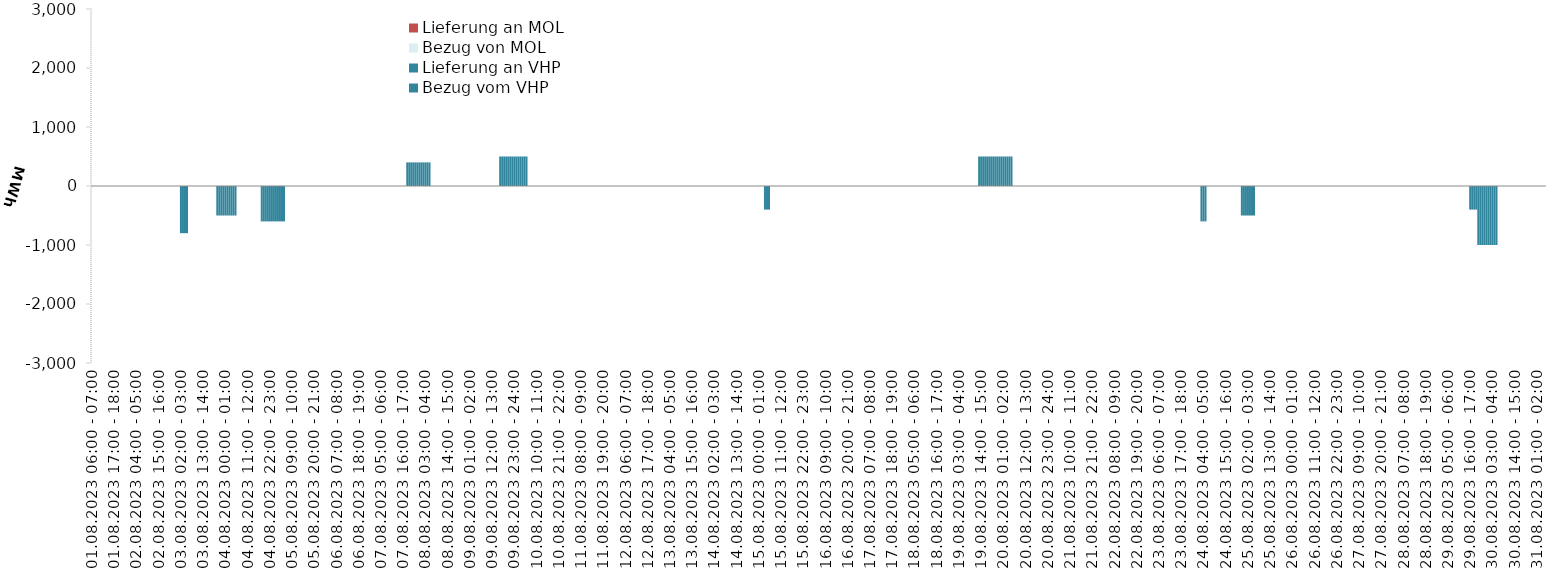
| Category | Bezug vom VHP | Lieferung an VHP | Bezug von MOL | Lieferung an MOL |
|---|---|---|---|---|
| 01.08.2023 06:00 - 07:00 | 0 | 0 | 0 | 0 |
| 01.08.2023 07:00 - 08:00 | 0 | 0 | 0 | 0 |
| 01.08.2023 08:00 - 09:00 | 0 | 0 | 0 | 0 |
| 01.08.2023 09:00 - 10:00 | 0 | 0 | 0 | 0 |
| 01.08.2023 10:00 - 11:00 | 0 | 0 | 0 | 0 |
| 01.08.2023 11:00 - 12:00 | 0 | 0 | 0 | 0 |
| 01.08.2023 12:00 - 13:00 | 0 | 0 | 0 | 0 |
| 01.08.2023 13:00 - 14:00 | 0 | 0 | 0 | 0 |
| 01.08.2023 14:00 - 15:00 | 0 | 0 | 0 | 0 |
| 01.08.2023 15:00 - 16:00 | 0 | 0 | 0 | 0 |
| 01.08.2023 16:00 - 17:00 | 0 | 0 | 0 | 0 |
| 01.08.2023 17:00 - 18:00 | 0 | 0 | 0 | 0 |
| 01.08.2023 18:00 - 19:00 | 0 | 0 | 0 | 0 |
| 01.08.2023 19:00 - 20:00 | 0 | 0 | 0 | 0 |
| 01.08.2023 20:00 - 21:00 | 0 | 0 | 0 | 0 |
| 01.08.2023 21:00 - 22:00 | 0 | 0 | 0 | 0 |
| 01.08.2023 22:00 - 23:00 | 0 | 0 | 0 | 0 |
| 01.08.2023 23:00 - 24:00 | 0 | 0 | 0 | 0 |
| 02.08.2023 00:00 - 01:00 | 0 | 0 | 0 | 0 |
| 02.08.2023 01:00 - 02:00 | 0 | 0 | 0 | 0 |
| 02.08.2023 02:00 - 03:00 | 0 | 0 | 0 | 0 |
| 02.08.2023 03:00 - 04:00 | 0 | 0 | 0 | 0 |
| 02.08.2023 04:00 - 05:00 | 0 | 0 | 0 | 0 |
| 02.08.2023 05:00 - 06:00 | 0 | 0 | 0 | 0 |
| 02.08.2023 06:00 - 07:00 | 0 | 0 | 0 | 0 |
| 02.08.2023 07:00 - 08:00 | 0 | 0 | 0 | 0 |
| 02.08.2023 08:00 - 09:00 | 0 | 0 | 0 | 0 |
| 02.08.2023 09:00 - 10:00 | 0 | 0 | 0 | 0 |
| 02.08.2023 10:00 - 11:00 | 0 | 0 | 0 | 0 |
| 02.08.2023 11:00 - 12:00 | 0 | 0 | 0 | 0 |
| 02.08.2023 12:00 - 13:00 | 0 | 0 | 0 | 0 |
| 02.08.2023 13:00 - 14:00 | 0 | 0 | 0 | 0 |
| 02.08.2023 14:00 - 15:00 | 0 | 0 | 0 | 0 |
| 02.08.2023 15:00 - 16:00 | 0 | 0 | 0 | 0 |
| 02.08.2023 16:00 - 17:00 | 0 | 0 | 0 | 0 |
| 02.08.2023 17:00 - 18:00 | 0 | 0 | 0 | 0 |
| 02.08.2023 18:00 - 19:00 | 0 | 0 | 0 | 0 |
| 02.08.2023 19:00 - 20:00 | 0 | 0 | 0 | 0 |
| 02.08.2023 20:00 - 21:00 | 0 | 0 | 0 | 0 |
| 02.08.2023 21:00 - 22:00 | 0 | 0 | 0 | 0 |
| 02.08.2023 22:00 - 23:00 | 0 | 0 | 0 | 0 |
| 02.08.2023 23:00 - 24:00 | 0 | 0 | 0 | 0 |
| 03.08.2023 00:00 - 01:00 | 0 | 0 | 0 | 0 |
| 03.08.2023 01:00 - 02:00 | 0 | 0 | 0 | 0 |
| 03.08.2023 02:00 - 03:00 | 0 | -800 | 0 | 0 |
| 03.08.2023 03:00 - 04:00 | 0 | -800 | 0 | 0 |
| 03.08.2023 04:00 - 05:00 | 0 | -800 | 0 | 0 |
| 03.08.2023 05:00 - 06:00 | 0 | -800 | 0 | 0 |
| 03.08.2023 06:00 - 07:00 | 0 | 0 | 0 | 0 |
| 03.08.2023 07:00 - 08:00 | 0 | 0 | 0 | 0 |
| 03.08.2023 08:00 - 09:00 | 0 | 0 | 0 | 0 |
| 03.08.2023 09:00 - 10:00 | 0 | 0 | 0 | 0 |
| 03.08.2023 10:00 - 11:00 | 0 | 0 | 0 | 0 |
| 03.08.2023 11:00 - 12:00 | 0 | 0 | 0 | 0 |
| 03.08.2023 12:00 - 13:00 | 0 | 0 | 0 | 0 |
| 03.08.2023 13:00 - 14:00 | 0 | 0 | 0 | 0 |
| 03.08.2023 14:00 - 15:00 | 0 | 0 | 0 | 0 |
| 03.08.2023 15:00 - 16:00 | 0 | 0 | 0 | 0 |
| 03.08.2023 16:00 - 17:00 | 0 | 0 | 0 | 0 |
| 03.08.2023 17:00 - 18:00 | 0 | 0 | 0 | 0 |
| 03.08.2023 18:00 - 19:00 | 0 | 0 | 0 | 0 |
| 03.08.2023 19:00 - 20:00 | 0 | 0 | 0 | 0 |
| 03.08.2023 20:00 - 21:00 | 0 | -500 | 0 | 0 |
| 03.08.2023 21:00 - 22:00 | 0 | -500 | 0 | 0 |
| 03.08.2023 22:00 - 23:00 | 0 | -500 | 0 | 0 |
| 03.08.2023 23:00 - 24:00 | 0 | -500 | 0 | 0 |
| 04.08.2023 00:00 - 01:00 | 0 | -500 | 0 | 0 |
| 04.08.2023 01:00 - 02:00 | 0 | -500 | 0 | 0 |
| 04.08.2023 02:00 - 03:00 | 0 | -500 | 0 | 0 |
| 04.08.2023 03:00 - 04:00 | 0 | -500 | 0 | 0 |
| 04.08.2023 04:00 - 05:00 | 0 | -500 | 0 | 0 |
| 04.08.2023 05:00 - 06:00 | 0 | -500 | 0 | 0 |
| 04.08.2023 06:00 - 07:00 | 0 | 0 | 0 | 0 |
| 04.08.2023 07:00 - 08:00 | 0 | 0 | 0 | 0 |
| 04.08.2023 08:00 - 09:00 | 0 | 0 | 0 | 0 |
| 04.08.2023 09:00 - 10:00 | 0 | 0 | 0 | 0 |
| 04.08.2023 10:00 - 11:00 | 0 | 0 | 0 | 0 |
| 04.08.2023 11:00 - 12:00 | 0 | 0 | 0 | 0 |
| 04.08.2023 12:00 - 13:00 | 0 | 0 | 0 | 0 |
| 04.08.2023 13:00 - 14:00 | 0 | 0 | 0 | 0 |
| 04.08.2023 14:00 - 15:00 | 0 | 0 | 0 | 0 |
| 04.08.2023 15:00 - 16:00 | 0 | 0 | 0 | 0 |
| 04.08.2023 16:00 - 17:00 | 0 | 0 | 0 | 0 |
| 04.08.2023 17:00 - 18:00 | 0 | 0 | 0 | 0 |
| 04.08.2023 18:00 - 19:00 | 0 | -600 | 0 | 0 |
| 04.08.2023 19:00 - 20:00 | 0 | -600 | 0 | 0 |
| 04.08.2023 20:00 - 21:00 | 0 | -600 | 0 | 0 |
| 04.08.2023 21:00 - 22:00 | 0 | -600 | 0 | 0 |
| 04.08.2023 22:00 - 23:00 | 0 | -600 | 0 | 0 |
| 04.08.2023 23:00 - 24:00 | 0 | -600 | 0 | 0 |
| 05.08.2023 00:00 - 01:00 | 0 | -600 | 0 | 0 |
| 05.08.2023 01:00 - 02:00 | 0 | -600 | 0 | 0 |
| 05.08.2023 02:00 - 03:00 | 0 | -600 | 0 | 0 |
| 05.08.2023 03:00 - 04:00 | 0 | -600 | 0 | 0 |
| 05.08.2023 04:00 - 05:00 | 0 | -600 | 0 | 0 |
| 05.08.2023 05:00 - 06:00 | 0 | -600 | 0 | 0 |
| 05.08.2023 06:00 - 07:00 | 0 | 0 | 0 | 0 |
| 05.08.2023 07:00 - 08:00 | 0 | 0 | 0 | 0 |
| 05.08.2023 08:00 - 09:00 | 0 | 0 | 0 | 0 |
| 05.08.2023 09:00 - 10:00 | 0 | 0 | 0 | 0 |
| 05.08.2023 10:00 - 11:00 | 0 | 0 | 0 | 0 |
| 05.08.2023 11:00 - 12:00 | 0 | 0 | 0 | 0 |
| 05.08.2023 12:00 - 13:00 | 0 | 0 | 0 | 0 |
| 05.08.2023 13:00 - 14:00 | 0 | 0 | 0 | 0 |
| 05.08.2023 14:00 - 15:00 | 0 | 0 | 0 | 0 |
| 05.08.2023 15:00 - 16:00 | 0 | 0 | 0 | 0 |
| 05.08.2023 16:00 - 17:00 | 0 | 0 | 0 | 0 |
| 05.08.2023 17:00 - 18:00 | 0 | 0 | 0 | 0 |
| 05.08.2023 18:00 - 19:00 | 0 | 0 | 0 | 0 |
| 05.08.2023 19:00 - 20:00 | 0 | 0 | 0 | 0 |
| 05.08.2023 20:00 - 21:00 | 0 | 0 | 0 | 0 |
| 05.08.2023 21:00 - 22:00 | 0 | 0 | 0 | 0 |
| 05.08.2023 22:00 - 23:00 | 0 | 0 | 0 | 0 |
| 05.08.2023 23:00 - 24:00 | 0 | 0 | 0 | 0 |
| 06.08.2023 00:00 - 01:00 | 0 | 0 | 0 | 0 |
| 06.08.2023 01:00 - 02:00 | 0 | 0 | 0 | 0 |
| 06.08.2023 02:00 - 03:00 | 0 | 0 | 0 | 0 |
| 06.08.2023 03:00 - 04:00 | 0 | 0 | 0 | 0 |
| 06.08.2023 04:00 - 05:00 | 0 | 0 | 0 | 0 |
| 06.08.2023 05:00 - 06:00 | 0 | 0 | 0 | 0 |
| 06.08.2023 06:00 - 07:00 | 0 | 0 | 0 | 0 |
| 06.08.2023 07:00 - 08:00 | 0 | 0 | 0 | 0 |
| 06.08.2023 08:00 - 09:00 | 0 | 0 | 0 | 0 |
| 06.08.2023 09:00 - 10:00 | 0 | 0 | 0 | 0 |
| 06.08.2023 10:00 - 11:00 | 0 | 0 | 0 | 0 |
| 06.08.2023 11:00 - 12:00 | 0 | 0 | 0 | 0 |
| 06.08.2023 12:00 - 13:00 | 0 | 0 | 0 | 0 |
| 06.08.2023 13:00 - 14:00 | 0 | 0 | 0 | 0 |
| 06.08.2023 14:00 - 15:00 | 0 | 0 | 0 | 0 |
| 06.08.2023 15:00 - 16:00 | 0 | 0 | 0 | 0 |
| 06.08.2023 16:00 - 17:00 | 0 | 0 | 0 | 0 |
| 06.08.2023 17:00 - 18:00 | 0 | 0 | 0 | 0 |
| 06.08.2023 18:00 - 19:00 | 0 | 0 | 0 | 0 |
| 06.08.2023 19:00 - 20:00 | 0 | 0 | 0 | 0 |
| 06.08.2023 20:00 - 21:00 | 0 | 0 | 0 | 0 |
| 06.08.2023 21:00 - 22:00 | 0 | 0 | 0 | 0 |
| 06.08.2023 22:00 - 23:00 | 0 | 0 | 0 | 0 |
| 06.08.2023 23:00 - 24:00 | 0 | 0 | 0 | 0 |
| 07.08.2023 00:00 - 01:00 | 0 | 0 | 0 | 0 |
| 07.08.2023 01:00 - 02:00 | 0 | 0 | 0 | 0 |
| 07.08.2023 02:00 - 03:00 | 0 | 0 | 0 | 0 |
| 07.08.2023 03:00 - 04:00 | 0 | 0 | 0 | 0 |
| 07.08.2023 04:00 - 05:00 | 0 | 0 | 0 | 0 |
| 07.08.2023 05:00 - 06:00 | 0 | 0 | 0 | 0 |
| 07.08.2023 06:00 - 07:00 | 0 | 0 | 0 | 0 |
| 07.08.2023 07:00 - 08:00 | 0 | 0 | 0 | 0 |
| 07.08.2023 08:00 - 09:00 | 0 | 0 | 0 | 0 |
| 07.08.2023 09:00 - 10:00 | 0 | 0 | 0 | 0 |
| 07.08.2023 10:00 - 11:00 | 0 | 0 | 0 | 0 |
| 07.08.2023 11:00 - 12:00 | 0 | 0 | 0 | 0 |
| 07.08.2023 12:00 - 13:00 | 0 | 0 | 0 | 0 |
| 07.08.2023 13:00 - 14:00 | 0 | 0 | 0 | 0 |
| 07.08.2023 14:00 - 15:00 | 0 | 0 | 0 | 0 |
| 07.08.2023 15:00 - 16:00 | 0 | 0 | 0 | 0 |
| 07.08.2023 16:00 - 17:00 | 0 | 0 | 0 | 0 |
| 07.08.2023 17:00 - 18:00 | 0 | 0 | 0 | 0 |
| 07.08.2023 18:00 - 19:00 | 400 | 0 | 0 | 0 |
| 07.08.2023 19:00 - 20:00 | 400 | 0 | 0 | 0 |
| 07.08.2023 20:00 - 21:00 | 400 | 0 | 0 | 0 |
| 07.08.2023 21:00 - 22:00 | 400 | 0 | 0 | 0 |
| 07.08.2023 22:00 - 23:00 | 400 | 0 | 0 | 0 |
| 07.08.2023 23:00 - 24:00 | 400 | 0 | 0 | 0 |
| 08.08.2023 00:00 - 01:00 | 400 | 0 | 0 | 0 |
| 08.08.2023 01:00 - 02:00 | 400 | 0 | 0 | 0 |
| 08.08.2023 02:00 - 03:00 | 400 | 0 | 0 | 0 |
| 08.08.2023 03:00 - 04:00 | 400 | 0 | 0 | 0 |
| 08.08.2023 04:00 - 05:00 | 400 | 0 | 0 | 0 |
| 08.08.2023 05:00 - 06:00 | 400 | 0 | 0 | 0 |
| 08.08.2023 06:00 - 07:00 | 0 | 0 | 0 | 0 |
| 08.08.2023 07:00 - 08:00 | 0 | 0 | 0 | 0 |
| 08.08.2023 08:00 - 09:00 | 0 | 0 | 0 | 0 |
| 08.08.2023 09:00 - 10:00 | 0 | 0 | 0 | 0 |
| 08.08.2023 10:00 - 11:00 | 0 | 0 | 0 | 0 |
| 08.08.2023 11:00 - 12:00 | 0 | 0 | 0 | 0 |
| 08.08.2023 12:00 - 13:00 | 0 | 0 | 0 | 0 |
| 08.08.2023 13:00 - 14:00 | 0 | 0 | 0 | 0 |
| 08.08.2023 14:00 - 15:00 | 0 | 0 | 0 | 0 |
| 08.08.2023 15:00 - 16:00 | 0 | 0 | 0 | 0 |
| 08.08.2023 16:00 - 17:00 | 0 | 0 | 0 | 0 |
| 08.08.2023 17:00 - 18:00 | 0 | 0 | 0 | 0 |
| 08.08.2023 18:00 - 19:00 | 0 | 0 | 0 | 0 |
| 08.08.2023 19:00 - 20:00 | 0 | 0 | 0 | 0 |
| 08.08.2023 20:00 - 21:00 | 0 | 0 | 0 | 0 |
| 08.08.2023 21:00 - 22:00 | 0 | 0 | 0 | 0 |
| 08.08.2023 22:00 - 23:00 | 0 | 0 | 0 | 0 |
| 08.08.2023 23:00 - 24:00 | 0 | 0 | 0 | 0 |
| 09.08.2023 00:00 - 01:00 | 0 | 0 | 0 | 0 |
| 09.08.2023 01:00 - 02:00 | 0 | 0 | 0 | 0 |
| 09.08.2023 02:00 - 03:00 | 0 | 0 | 0 | 0 |
| 09.08.2023 03:00 - 04:00 | 0 | 0 | 0 | 0 |
| 09.08.2023 04:00 - 05:00 | 0 | 0 | 0 | 0 |
| 09.08.2023 05:00 - 06:00 | 0 | 0 | 0 | 0 |
| 09.08.2023 06:00 - 07:00 | 0 | 0 | 0 | 0 |
| 09.08.2023 07:00 - 08:00 | 0 | 0 | 0 | 0 |
| 09.08.2023 08:00 - 09:00 | 0 | 0 | 0 | 0 |
| 09.08.2023 09:00 - 10:00 | 0 | 0 | 0 | 0 |
| 09.08.2023 10:00 - 11:00 | 0 | 0 | 0 | 0 |
| 09.08.2023 11:00 - 12:00 | 0 | 0 | 0 | 0 |
| 09.08.2023 12:00 - 13:00 | 0 | 0 | 0 | 0 |
| 09.08.2023 13:00 - 14:00 | 0 | 0 | 0 | 0 |
| 09.08.2023 14:00 - 15:00 | 0 | 0 | 0 | 0 |
| 09.08.2023 15:00 - 16:00 | 0 | 0 | 0 | 0 |
| 09.08.2023 16:00 - 17:00 | 500 | 0 | 0 | 0 |
| 09.08.2023 17:00 - 18:00 | 500 | 0 | 0 | 0 |
| 09.08.2023 18:00 - 19:00 | 500 | 0 | 0 | 0 |
| 09.08.2023 19:00 - 20:00 | 500 | 0 | 0 | 0 |
| 09.08.2023 20:00 - 21:00 | 500 | 0 | 0 | 0 |
| 09.08.2023 21:00 - 22:00 | 500 | 0 | 0 | 0 |
| 09.08.2023 22:00 - 23:00 | 500 | 0 | 0 | 0 |
| 09.08.2023 23:00 - 24:00 | 500 | 0 | 0 | 0 |
| 10.08.2023 00:00 - 01:00 | 500 | 0 | 0 | 0 |
| 10.08.2023 01:00 - 02:00 | 500 | 0 | 0 | 0 |
| 10.08.2023 02:00 - 03:00 | 500 | 0 | 0 | 0 |
| 10.08.2023 03:00 - 04:00 | 500 | 0 | 0 | 0 |
| 10.08.2023 04:00 - 05:00 | 500 | 0 | 0 | 0 |
| 10.08.2023 05:00 - 06:00 | 500 | 0 | 0 | 0 |
| 10.08.2023 06:00 - 07:00 | 0 | 0 | 0 | 0 |
| 10.08.2023 07:00 - 08:00 | 0 | 0 | 0 | 0 |
| 10.08.2023 08:00 - 09:00 | 0 | 0 | 0 | 0 |
| 10.08.2023 09:00 - 10:00 | 0 | 0 | 0 | 0 |
| 10.08.2023 10:00 - 11:00 | 0 | 0 | 0 | 0 |
| 10.08.2023 11:00 - 12:00 | 0 | 0 | 0 | 0 |
| 10.08.2023 12:00 - 13:00 | 0 | 0 | 0 | 0 |
| 10.08.2023 13:00 - 14:00 | 0 | 0 | 0 | 0 |
| 10.08.2023 14:00 - 15:00 | 0 | 0 | 0 | 0 |
| 10.08.2023 15:00 - 16:00 | 0 | 0 | 0 | 0 |
| 10.08.2023 16:00 - 17:00 | 0 | 0 | 0 | 0 |
| 10.08.2023 17:00 - 18:00 | 0 | 0 | 0 | 0 |
| 10.08.2023 18:00 - 19:00 | 0 | 0 | 0 | 0 |
| 10.08.2023 19:00 - 20:00 | 0 | 0 | 0 | 0 |
| 10.08.2023 20:00 - 21:00 | 0 | 0 | 0 | 0 |
| 10.08.2023 21:00 - 22:00 | 0 | 0 | 0 | 0 |
| 10.08.2023 22:00 - 23:00 | 0 | 0 | 0 | 0 |
| 10.08.2023 23:00 - 24:00 | 0 | 0 | 0 | 0 |
| 11.08.2023 00:00 - 01:00 | 0 | 0 | 0 | 0 |
| 11.08.2023 01:00 - 02:00 | 0 | 0 | 0 | 0 |
| 11.08.2023 02:00 - 03:00 | 0 | 0 | 0 | 0 |
| 11.08.2023 03:00 - 04:00 | 0 | 0 | 0 | 0 |
| 11.08.2023 04:00 - 05:00 | 0 | 0 | 0 | 0 |
| 11.08.2023 05:00 - 06:00 | 0 | 0 | 0 | 0 |
| 11.08.2023 06:00 - 07:00 | 0 | 0 | 0 | 0 |
| 11.08.2023 07:00 - 08:00 | 0 | 0 | 0 | 0 |
| 11.08.2023 08:00 - 09:00 | 0 | 0 | 0 | 0 |
| 11.08.2023 09:00 - 10:00 | 0 | 0 | 0 | 0 |
| 11.08.2023 10:00 - 11:00 | 0 | 0 | 0 | 0 |
| 11.08.2023 11:00 - 12:00 | 0 | 0 | 0 | 0 |
| 11.08.2023 12:00 - 13:00 | 0 | 0 | 0 | 0 |
| 11.08.2023 13:00 - 14:00 | 0 | 0 | 0 | 0 |
| 11.08.2023 14:00 - 15:00 | 0 | 0 | 0 | 0 |
| 11.08.2023 15:00 - 16:00 | 0 | 0 | 0 | 0 |
| 11.08.2023 16:00 - 17:00 | 0 | 0 | 0 | 0 |
| 11.08.2023 17:00 - 18:00 | 0 | 0 | 0 | 0 |
| 11.08.2023 18:00 - 19:00 | 0 | 0 | 0 | 0 |
| 11.08.2023 19:00 - 20:00 | 0 | 0 | 0 | 0 |
| 11.08.2023 20:00 - 21:00 | 0 | 0 | 0 | 0 |
| 11.08.2023 21:00 - 22:00 | 0 | 0 | 0 | 0 |
| 11.08.2023 22:00 - 23:00 | 0 | 0 | 0 | 0 |
| 11.08.2023 23:00 - 24:00 | 0 | 0 | 0 | 0 |
| 12.08.2023 00:00 - 01:00 | 0 | 0 | 0 | 0 |
| 12.08.2023 01:00 - 02:00 | 0 | 0 | 0 | 0 |
| 12.08.2023 02:00 - 03:00 | 0 | 0 | 0 | 0 |
| 12.08.2023 03:00 - 04:00 | 0 | 0 | 0 | 0 |
| 12.08.2023 04:00 - 05:00 | 0 | 0 | 0 | 0 |
| 12.08.2023 05:00 - 06:00 | 0 | 0 | 0 | 0 |
| 12.08.2023 06:00 - 07:00 | 0 | 0 | 0 | 0 |
| 12.08.2023 07:00 - 08:00 | 0 | 0 | 0 | 0 |
| 12.08.2023 08:00 - 09:00 | 0 | 0 | 0 | 0 |
| 12.08.2023 09:00 - 10:00 | 0 | 0 | 0 | 0 |
| 12.08.2023 10:00 - 11:00 | 0 | 0 | 0 | 0 |
| 12.08.2023 11:00 - 12:00 | 0 | 0 | 0 | 0 |
| 12.08.2023 12:00 - 13:00 | 0 | 0 | 0 | 0 |
| 12.08.2023 13:00 - 14:00 | 0 | 0 | 0 | 0 |
| 12.08.2023 14:00 - 15:00 | 0 | 0 | 0 | 0 |
| 12.08.2023 15:00 - 16:00 | 0 | 0 | 0 | 0 |
| 12.08.2023 16:00 - 17:00 | 0 | 0 | 0 | 0 |
| 12.08.2023 17:00 - 18:00 | 0 | 0 | 0 | 0 |
| 12.08.2023 18:00 - 19:00 | 0 | 0 | 0 | 0 |
| 12.08.2023 19:00 - 20:00 | 0 | 0 | 0 | 0 |
| 12.08.2023 20:00 - 21:00 | 0 | 0 | 0 | 0 |
| 12.08.2023 21:00 - 22:00 | 0 | 0 | 0 | 0 |
| 12.08.2023 22:00 - 23:00 | 0 | 0 | 0 | 0 |
| 12.08.2023 23:00 - 24:00 | 0 | 0 | 0 | 0 |
| 13.08.2023 00:00 - 01:00 | 0 | 0 | 0 | 0 |
| 13.08.2023 01:00 - 02:00 | 0 | 0 | 0 | 0 |
| 13.08.2023 02:00 - 03:00 | 0 | 0 | 0 | 0 |
| 13.08.2023 03:00 - 04:00 | 0 | 0 | 0 | 0 |
| 13.08.2023 04:00 - 05:00 | 0 | 0 | 0 | 0 |
| 13.08.2023 05:00 - 06:00 | 0 | 0 | 0 | 0 |
| 13.08.2023 06:00 - 07:00 | 0 | 0 | 0 | 0 |
| 13.08.2023 07:00 - 08:00 | 0 | 0 | 0 | 0 |
| 13.08.2023 08:00 - 09:00 | 0 | 0 | 0 | 0 |
| 13.08.2023 09:00 - 10:00 | 0 | 0 | 0 | 0 |
| 13.08.2023 10:00 - 11:00 | 0 | 0 | 0 | 0 |
| 13.08.2023 11:00 - 12:00 | 0 | 0 | 0 | 0 |
| 13.08.2023 12:00 - 13:00 | 0 | 0 | 0 | 0 |
| 13.08.2023 13:00 - 14:00 | 0 | 0 | 0 | 0 |
| 13.08.2023 14:00 - 15:00 | 0 | 0 | 0 | 0 |
| 13.08.2023 15:00 - 16:00 | 0 | 0 | 0 | 0 |
| 13.08.2023 16:00 - 17:00 | 0 | 0 | 0 | 0 |
| 13.08.2023 17:00 - 18:00 | 0 | 0 | 0 | 0 |
| 13.08.2023 18:00 - 19:00 | 0 | 0 | 0 | 0 |
| 13.08.2023 19:00 - 20:00 | 0 | 0 | 0 | 0 |
| 13.08.2023 20:00 - 21:00 | 0 | 0 | 0 | 0 |
| 13.08.2023 21:00 - 22:00 | 0 | 0 | 0 | 0 |
| 13.08.2023 22:00 - 23:00 | 0 | 0 | 0 | 0 |
| 13.08.2023 23:00 - 24:00 | 0 | 0 | 0 | 0 |
| 14.08.2023 00:00 - 01:00 | 0 | 0 | 0 | 0 |
| 14.08.2023 01:00 - 02:00 | 0 | 0 | 0 | 0 |
| 14.08.2023 02:00 - 03:00 | 0 | 0 | 0 | 0 |
| 14.08.2023 03:00 - 04:00 | 0 | 0 | 0 | 0 |
| 14.08.2023 04:00 - 05:00 | 0 | 0 | 0 | 0 |
| 14.08.2023 05:00 - 06:00 | 0 | 0 | 0 | 0 |
| 14.08.2023 06:00 - 07:00 | 0 | 0 | 0 | 0 |
| 14.08.2023 07:00 - 08:00 | 0 | 0 | 0 | 0 |
| 14.08.2023 08:00 - 09:00 | 0 | 0 | 0 | 0 |
| 14.08.2023 09:00 - 10:00 | 0 | 0 | 0 | 0 |
| 14.08.2023 10:00 - 11:00 | 0 | 0 | 0 | 0 |
| 14.08.2023 11:00 - 12:00 | 0 | 0 | 0 | 0 |
| 14.08.2023 12:00 - 13:00 | 0 | 0 | 0 | 0 |
| 14.08.2023 13:00 - 14:00 | 0 | 0 | 0 | 0 |
| 14.08.2023 14:00 - 15:00 | 0 | 0 | 0 | 0 |
| 14.08.2023 15:00 - 16:00 | 0 | 0 | 0 | 0 |
| 14.08.2023 16:00 - 17:00 | 0 | 0 | 0 | 0 |
| 14.08.2023 17:00 - 18:00 | 0 | 0 | 0 | 0 |
| 14.08.2023 18:00 - 19:00 | 0 | 0 | 0 | 0 |
| 14.08.2023 19:00 - 20:00 | 0 | 0 | 0 | 0 |
| 14.08.2023 20:00 - 21:00 | 0 | 0 | 0 | 0 |
| 14.08.2023 21:00 - 22:00 | 0 | 0 | 0 | 0 |
| 14.08.2023 22:00 - 23:00 | 0 | 0 | 0 | 0 |
| 14.08.2023 23:00 - 24:00 | 0 | 0 | 0 | 0 |
| 15.08.2023 00:00 - 01:00 | 0 | 0 | 0 | 0 |
| 15.08.2023 01:00 - 02:00 | 0 | 0 | 0 | 0 |
| 15.08.2023 02:00 - 03:00 | 0 | 0 | 0 | 0 |
| 15.08.2023 03:00 - 04:00 | 0 | -400 | 0 | 0 |
| 15.08.2023 04:00 - 05:00 | 0 | -400 | 0 | 0 |
| 15.08.2023 05:00 - 06:00 | 0 | -400 | 0 | 0 |
| 15.08.2023 06:00 - 07:00 | 0 | 0 | 0 | 0 |
| 15.08.2023 07:00 - 08:00 | 0 | 0 | 0 | 0 |
| 15.08.2023 08:00 - 09:00 | 0 | 0 | 0 | 0 |
| 15.08.2023 09:00 - 10:00 | 0 | 0 | 0 | 0 |
| 15.08.2023 10:00 - 11:00 | 0 | 0 | 0 | 0 |
| 15.08.2023 11:00 - 12:00 | 0 | 0 | 0 | 0 |
| 15.08.2023 12:00 - 13:00 | 0 | 0 | 0 | 0 |
| 15.08.2023 13:00 - 14:00 | 0 | 0 | 0 | 0 |
| 15.08.2023 14:00 - 15:00 | 0 | 0 | 0 | 0 |
| 15.08.2023 15:00 - 16:00 | 0 | 0 | 0 | 0 |
| 15.08.2023 16:00 - 17:00 | 0 | 0 | 0 | 0 |
| 15.08.2023 17:00 - 18:00 | 0 | 0 | 0 | 0 |
| 15.08.2023 18:00 - 19:00 | 0 | 0 | 0 | 0 |
| 15.08.2023 19:00 - 20:00 | 0 | 0 | 0 | 0 |
| 15.08.2023 20:00 - 21:00 | 0 | 0 | 0 | 0 |
| 15.08.2023 21:00 - 22:00 | 0 | 0 | 0 | 0 |
| 15.08.2023 22:00 - 23:00 | 0 | 0 | 0 | 0 |
| 15.08.2023 23:00 - 24:00 | 0 | 0 | 0 | 0 |
| 16.08.2023 00:00 - 01:00 | 0 | 0 | 0 | 0 |
| 16.08.2023 01:00 - 02:00 | 0 | 0 | 0 | 0 |
| 16.08.2023 02:00 - 03:00 | 0 | 0 | 0 | 0 |
| 16.08.2023 03:00 - 04:00 | 0 | 0 | 0 | 0 |
| 16.08.2023 04:00 - 05:00 | 0 | 0 | 0 | 0 |
| 16.08.2023 05:00 - 06:00 | 0 | 0 | 0 | 0 |
| 16.08.2023 06:00 - 07:00 | 0 | 0 | 0 | 0 |
| 16.08.2023 07:00 - 08:00 | 0 | 0 | 0 | 0 |
| 16.08.2023 08:00 - 09:00 | 0 | 0 | 0 | 0 |
| 16.08.2023 09:00 - 10:00 | 0 | 0 | 0 | 0 |
| 16.08.2023 10:00 - 11:00 | 0 | 0 | 0 | 0 |
| 16.08.2023 11:00 - 12:00 | 0 | 0 | 0 | 0 |
| 16.08.2023 12:00 - 13:00 | 0 | 0 | 0 | 0 |
| 16.08.2023 13:00 - 14:00 | 0 | 0 | 0 | 0 |
| 16.08.2023 14:00 - 15:00 | 0 | 0 | 0 | 0 |
| 16.08.2023 15:00 - 16:00 | 0 | 0 | 0 | 0 |
| 16.08.2023 16:00 - 17:00 | 0 | 0 | 0 | 0 |
| 16.08.2023 17:00 - 18:00 | 0 | 0 | 0 | 0 |
| 16.08.2023 18:00 - 19:00 | 0 | 0 | 0 | 0 |
| 16.08.2023 19:00 - 20:00 | 0 | 0 | 0 | 0 |
| 16.08.2023 20:00 - 21:00 | 0 | 0 | 0 | 0 |
| 16.08.2023 21:00 - 22:00 | 0 | 0 | 0 | 0 |
| 16.08.2023 22:00 - 23:00 | 0 | 0 | 0 | 0 |
| 16.08.2023 23:00 - 24:00 | 0 | 0 | 0 | 0 |
| 17.08.2023 00:00 - 01:00 | 0 | 0 | 0 | 0 |
| 17.08.2023 01:00 - 02:00 | 0 | 0 | 0 | 0 |
| 17.08.2023 02:00 - 03:00 | 0 | 0 | 0 | 0 |
| 17.08.2023 03:00 - 04:00 | 0 | 0 | 0 | 0 |
| 17.08.2023 04:00 - 05:00 | 0 | 0 | 0 | 0 |
| 17.08.2023 05:00 - 06:00 | 0 | 0 | 0 | 0 |
| 17.08.2023 06:00 - 07:00 | 0 | 0 | 0 | 0 |
| 17.08.2023 07:00 - 08:00 | 0 | 0 | 0 | 0 |
| 17.08.2023 08:00 - 09:00 | 0 | 0 | 0 | 0 |
| 17.08.2023 09:00 - 10:00 | 0 | 0 | 0 | 0 |
| 17.08.2023 10:00 - 11:00 | 0 | 0 | 0 | 0 |
| 17.08.2023 11:00 - 12:00 | 0 | 0 | 0 | 0 |
| 17.08.2023 12:00 - 13:00 | 0 | 0 | 0 | 0 |
| 17.08.2023 13:00 - 14:00 | 0 | 0 | 0 | 0 |
| 17.08.2023 14:00 - 15:00 | 0 | 0 | 0 | 0 |
| 17.08.2023 15:00 - 16:00 | 0 | 0 | 0 | 0 |
| 17.08.2023 16:00 - 17:00 | 0 | 0 | 0 | 0 |
| 17.08.2023 17:00 - 18:00 | 0 | 0 | 0 | 0 |
| 17.08.2023 18:00 - 19:00 | 0 | 0 | 0 | 0 |
| 17.08.2023 19:00 - 20:00 | 0 | 0 | 0 | 0 |
| 17.08.2023 20:00 - 21:00 | 0 | 0 | 0 | 0 |
| 17.08.2023 21:00 - 22:00 | 0 | 0 | 0 | 0 |
| 17.08.2023 22:00 - 23:00 | 0 | 0 | 0 | 0 |
| 17.08.2023 23:00 - 24:00 | 0 | 0 | 0 | 0 |
| 18.08.2023 00:00 - 01:00 | 0 | 0 | 0 | 0 |
| 18.08.2023 01:00 - 02:00 | 0 | 0 | 0 | 0 |
| 18.08.2023 02:00 - 03:00 | 0 | 0 | 0 | 0 |
| 18.08.2023 03:00 - 04:00 | 0 | 0 | 0 | 0 |
| 18.08.2023 04:00 - 05:00 | 0 | 0 | 0 | 0 |
| 18.08.2023 05:00 - 06:00 | 0 | 0 | 0 | 0 |
| 18.08.2023 06:00 - 07:00 | 0 | 0 | 0 | 0 |
| 18.08.2023 07:00 - 08:00 | 0 | 0 | 0 | 0 |
| 18.08.2023 08:00 - 09:00 | 0 | 0 | 0 | 0 |
| 18.08.2023 09:00 - 10:00 | 0 | 0 | 0 | 0 |
| 18.08.2023 10:00 - 11:00 | 0 | 0 | 0 | 0 |
| 18.08.2023 11:00 - 12:00 | 0 | 0 | 0 | 0 |
| 18.08.2023 12:00 - 13:00 | 0 | 0 | 0 | 0 |
| 18.08.2023 13:00 - 14:00 | 0 | 0 | 0 | 0 |
| 18.08.2023 14:00 - 15:00 | 0 | 0 | 0 | 0 |
| 18.08.2023 15:00 - 16:00 | 0 | 0 | 0 | 0 |
| 18.08.2023 16:00 - 17:00 | 0 | 0 | 0 | 0 |
| 18.08.2023 17:00 - 18:00 | 0 | 0 | 0 | 0 |
| 18.08.2023 18:00 - 19:00 | 0 | 0 | 0 | 0 |
| 18.08.2023 19:00 - 20:00 | 0 | 0 | 0 | 0 |
| 18.08.2023 20:00 - 21:00 | 0 | 0 | 0 | 0 |
| 18.08.2023 21:00 - 22:00 | 0 | 0 | 0 | 0 |
| 18.08.2023 22:00 - 23:00 | 0 | 0 | 0 | 0 |
| 18.08.2023 23:00 - 24:00 | 0 | 0 | 0 | 0 |
| 19.08.2023 00:00 - 01:00 | 0 | 0 | 0 | 0 |
| 19.08.2023 01:00 - 02:00 | 0 | 0 | 0 | 0 |
| 19.08.2023 02:00 - 03:00 | 0 | 0 | 0 | 0 |
| 19.08.2023 03:00 - 04:00 | 0 | 0 | 0 | 0 |
| 19.08.2023 04:00 - 05:00 | 0 | 0 | 0 | 0 |
| 19.08.2023 05:00 - 06:00 | 0 | 0 | 0 | 0 |
| 19.08.2023 06:00 - 07:00 | 0 | 0 | 0 | 0 |
| 19.08.2023 07:00 - 08:00 | 0 | 0 | 0 | 0 |
| 19.08.2023 08:00 - 09:00 | 0 | 0 | 0 | 0 |
| 19.08.2023 09:00 - 10:00 | 0 | 0 | 0 | 0 |
| 19.08.2023 10:00 - 11:00 | 0 | 0 | 0 | 0 |
| 19.08.2023 11:00 - 12:00 | 0 | 0 | 0 | 0 |
| 19.08.2023 12:00 - 13:00 | 0 | 0 | 0 | 0 |
| 19.08.2023 13:00 - 14:00 | 500 | 0 | 0 | 0 |
| 19.08.2023 14:00 - 15:00 | 500 | 0 | 0 | 0 |
| 19.08.2023 15:00 - 16:00 | 500 | 0 | 0 | 0 |
| 19.08.2023 16:00 - 17:00 | 500 | 0 | 0 | 0 |
| 19.08.2023 17:00 - 18:00 | 500 | 0 | 0 | 0 |
| 19.08.2023 18:00 - 19:00 | 500 | 0 | 0 | 0 |
| 19.08.2023 19:00 - 20:00 | 500 | 0 | 0 | 0 |
| 19.08.2023 20:00 - 21:00 | 500 | 0 | 0 | 0 |
| 19.08.2023 21:00 - 22:00 | 500 | 0 | 0 | 0 |
| 19.08.2023 22:00 - 23:00 | 500 | 0 | 0 | 0 |
| 19.08.2023 23:00 - 24:00 | 500 | 0 | 0 | 0 |
| 20.08.2023 00:00 - 01:00 | 500 | 0 | 0 | 0 |
| 20.08.2023 01:00 - 02:00 | 500 | 0 | 0 | 0 |
| 20.08.2023 02:00 - 03:00 | 500 | 0 | 0 | 0 |
| 20.08.2023 03:00 - 04:00 | 500 | 0 | 0 | 0 |
| 20.08.2023 04:00 - 05:00 | 500 | 0 | 0 | 0 |
| 20.08.2023 05:00 - 06:00 | 500 | 0 | 0 | 0 |
| 20.08.2023 06:00 - 07:00 | 0 | 0 | 0 | 0 |
| 20.08.2023 07:00 - 08:00 | 0 | 0 | 0 | 0 |
| 20.08.2023 08:00 - 09:00 | 0 | 0 | 0 | 0 |
| 20.08.2023 09:00 - 10:00 | 0 | 0 | 0 | 0 |
| 20.08.2023 10:00 - 11:00 | 0 | 0 | 0 | 0 |
| 20.08.2023 11:00 - 12:00 | 0 | 0 | 0 | 0 |
| 20.08.2023 12:00 - 13:00 | 0 | 0 | 0 | 0 |
| 20.08.2023 13:00 - 14:00 | 0 | 0 | 0 | 0 |
| 20.08.2023 14:00 - 15:00 | 0 | 0 | 0 | 0 |
| 20.08.2023 15:00 - 16:00 | 0 | 0 | 0 | 0 |
| 20.08.2023 16:00 - 17:00 | 0 | 0 | 0 | 0 |
| 20.08.2023 17:00 - 18:00 | 0 | 0 | 0 | 0 |
| 20.08.2023 18:00 - 19:00 | 0 | 0 | 0 | 0 |
| 20.08.2023 19:00 - 20:00 | 0 | 0 | 0 | 0 |
| 20.08.2023 20:00 - 21:00 | 0 | 0 | 0 | 0 |
| 20.08.2023 21:00 - 22:00 | 0 | 0 | 0 | 0 |
| 20.08.2023 22:00 - 23:00 | 0 | 0 | 0 | 0 |
| 20.08.2023 23:00 - 24:00 | 0 | 0 | 0 | 0 |
| 21.08.2023 00:00 - 01:00 | 0 | 0 | 0 | 0 |
| 21.08.2023 01:00 - 02:00 | 0 | 0 | 0 | 0 |
| 21.08.2023 02:00 - 03:00 | 0 | 0 | 0 | 0 |
| 21.08.2023 03:00 - 04:00 | 0 | 0 | 0 | 0 |
| 21.08.2023 04:00 - 05:00 | 0 | 0 | 0 | 0 |
| 21.08.2023 05:00 - 06:00 | 0 | 0 | 0 | 0 |
| 21.08.2023 06:00 - 07:00 | 0 | 0 | 0 | 0 |
| 21.08.2023 07:00 - 08:00 | 0 | 0 | 0 | 0 |
| 21.08.2023 08:00 - 09:00 | 0 | 0 | 0 | 0 |
| 21.08.2023 09:00 - 10:00 | 0 | 0 | 0 | 0 |
| 21.08.2023 10:00 - 11:00 | 0 | 0 | 0 | 0 |
| 21.08.2023 11:00 - 12:00 | 0 | 0 | 0 | 0 |
| 21.08.2023 12:00 - 13:00 | 0 | 0 | 0 | 0 |
| 21.08.2023 13:00 - 14:00 | 0 | 0 | 0 | 0 |
| 21.08.2023 14:00 - 15:00 | 0 | 0 | 0 | 0 |
| 21.08.2023 15:00 - 16:00 | 0 | 0 | 0 | 0 |
| 21.08.2023 16:00 - 17:00 | 0 | 0 | 0 | 0 |
| 21.08.2023 17:00 - 18:00 | 0 | 0 | 0 | 0 |
| 21.08.2023 18:00 - 19:00 | 0 | 0 | 0 | 0 |
| 21.08.2023 19:00 - 20:00 | 0 | 0 | 0 | 0 |
| 21.08.2023 20:00 - 21:00 | 0 | 0 | 0 | 0 |
| 21.08.2023 21:00 - 22:00 | 0 | 0 | 0 | 0 |
| 21.08.2023 22:00 - 23:00 | 0 | 0 | 0 | 0 |
| 21.08.2023 23:00 - 24:00 | 0 | 0 | 0 | 0 |
| 22.08.2023 00:00 - 01:00 | 0 | 0 | 0 | 0 |
| 22.08.2023 01:00 - 02:00 | 0 | 0 | 0 | 0 |
| 22.08.2023 02:00 - 03:00 | 0 | 0 | 0 | 0 |
| 22.08.2023 03:00 - 04:00 | 0 | 0 | 0 | 0 |
| 22.08.2023 04:00 - 05:00 | 0 | 0 | 0 | 0 |
| 22.08.2023 05:00 - 06:00 | 0 | 0 | 0 | 0 |
| 22.08.2023 06:00 - 07:00 | 0 | 0 | 0 | 0 |
| 22.08.2023 07:00 - 08:00 | 0 | 0 | 0 | 0 |
| 22.08.2023 08:00 - 09:00 | 0 | 0 | 0 | 0 |
| 22.08.2023 09:00 - 10:00 | 0 | 0 | 0 | 0 |
| 22.08.2023 10:00 - 11:00 | 0 | 0 | 0 | 0 |
| 22.08.2023 11:00 - 12:00 | 0 | 0 | 0 | 0 |
| 22.08.2023 12:00 - 13:00 | 0 | 0 | 0 | 0 |
| 22.08.2023 13:00 - 14:00 | 0 | 0 | 0 | 0 |
| 22.08.2023 14:00 - 15:00 | 0 | 0 | 0 | 0 |
| 22.08.2023 15:00 - 16:00 | 0 | 0 | 0 | 0 |
| 22.08.2023 16:00 - 17:00 | 0 | 0 | 0 | 0 |
| 22.08.2023 17:00 - 18:00 | 0 | 0 | 0 | 0 |
| 22.08.2023 18:00 - 19:00 | 0 | 0 | 0 | 0 |
| 22.08.2023 19:00 - 20:00 | 0 | 0 | 0 | 0 |
| 22.08.2023 20:00 - 21:00 | 0 | 0 | 0 | 0 |
| 22.08.2023 21:00 - 22:00 | 0 | 0 | 0 | 0 |
| 22.08.2023 22:00 - 23:00 | 0 | 0 | 0 | 0 |
| 22.08.2023 23:00 - 24:00 | 0 | 0 | 0 | 0 |
| 23.08.2023 00:00 - 01:00 | 0 | 0 | 0 | 0 |
| 23.08.2023 01:00 - 02:00 | 0 | 0 | 0 | 0 |
| 23.08.2023 02:00 - 03:00 | 0 | 0 | 0 | 0 |
| 23.08.2023 03:00 - 04:00 | 0 | 0 | 0 | 0 |
| 23.08.2023 04:00 - 05:00 | 0 | 0 | 0 | 0 |
| 23.08.2023 05:00 - 06:00 | 0 | 0 | 0 | 0 |
| 23.08.2023 06:00 - 07:00 | 0 | 0 | 0 | 0 |
| 23.08.2023 07:00 - 08:00 | 0 | 0 | 0 | 0 |
| 23.08.2023 08:00 - 09:00 | 0 | 0 | 0 | 0 |
| 23.08.2023 09:00 - 10:00 | 0 | 0 | 0 | 0 |
| 23.08.2023 10:00 - 11:00 | 0 | 0 | 0 | 0 |
| 23.08.2023 11:00 - 12:00 | 0 | 0 | 0 | 0 |
| 23.08.2023 12:00 - 13:00 | 0 | 0 | 0 | 0 |
| 23.08.2023 13:00 - 14:00 | 0 | 0 | 0 | 0 |
| 23.08.2023 14:00 - 15:00 | 0 | 0 | 0 | 0 |
| 23.08.2023 15:00 - 16:00 | 0 | 0 | 0 | 0 |
| 23.08.2023 16:00 - 17:00 | 0 | 0 | 0 | 0 |
| 23.08.2023 17:00 - 18:00 | 0 | 0 | 0 | 0 |
| 23.08.2023 18:00 - 19:00 | 0 | 0 | 0 | 0 |
| 23.08.2023 19:00 - 20:00 | 0 | 0 | 0 | 0 |
| 23.08.2023 20:00 - 21:00 | 0 | 0 | 0 | 0 |
| 23.08.2023 21:00 - 22:00 | 0 | 0 | 0 | 0 |
| 23.08.2023 22:00 - 23:00 | 0 | 0 | 0 | 0 |
| 23.08.2023 23:00 - 24:00 | 0 | 0 | 0 | 0 |
| 24.08.2023 00:00 - 01:00 | 0 | 0 | 0 | 0 |
| 24.08.2023 01:00 - 02:00 | 0 | 0 | 0 | 0 |
| 24.08.2023 02:00 - 03:00 | 0 | 0 | 0 | 0 |
| 24.08.2023 03:00 - 04:00 | 0 | -600 | 0 | 0 |
| 24.08.2023 04:00 - 05:00 | 0 | -600 | 0 | 0 |
| 24.08.2023 05:00 - 06:00 | 0 | -600 | 0 | 0 |
| 24.08.2023 06:00 - 07:00 | 0 | 0 | 0 | 0 |
| 24.08.2023 07:00 - 08:00 | 0 | 0 | 0 | 0 |
| 24.08.2023 08:00 - 09:00 | 0 | 0 | 0 | 0 |
| 24.08.2023 09:00 - 10:00 | 0 | 0 | 0 | 0 |
| 24.08.2023 10:00 - 11:00 | 0 | 0 | 0 | 0 |
| 24.08.2023 11:00 - 12:00 | 0 | 0 | 0 | 0 |
| 24.08.2023 12:00 - 13:00 | 0 | 0 | 0 | 0 |
| 24.08.2023 13:00 - 14:00 | 0 | 0 | 0 | 0 |
| 24.08.2023 14:00 - 15:00 | 0 | 0 | 0 | 0 |
| 24.08.2023 15:00 - 16:00 | 0 | 0 | 0 | 0 |
| 24.08.2023 16:00 - 17:00 | 0 | 0 | 0 | 0 |
| 24.08.2023 17:00 - 18:00 | 0 | 0 | 0 | 0 |
| 24.08.2023 18:00 - 19:00 | 0 | 0 | 0 | 0 |
| 24.08.2023 19:00 - 20:00 | 0 | 0 | 0 | 0 |
| 24.08.2023 20:00 - 21:00 | 0 | 0 | 0 | 0 |
| 24.08.2023 21:00 - 22:00 | 0 | 0 | 0 | 0 |
| 24.08.2023 22:00 - 23:00 | 0 | 0 | 0 | 0 |
| 24.08.2023 23:00 - 24:00 | 0 | -500 | 0 | 0 |
| 25.08.2023 00:00 - 01:00 | 0 | -500 | 0 | 0 |
| 25.08.2023 01:00 - 02:00 | 0 | -500 | 0 | 0 |
| 25.08.2023 02:00 - 03:00 | 0 | -500 | 0 | 0 |
| 25.08.2023 03:00 - 04:00 | 0 | -500 | 0 | 0 |
| 25.08.2023 04:00 - 05:00 | 0 | -500 | 0 | 0 |
| 25.08.2023 05:00 - 06:00 | 0 | -500 | 0 | 0 |
| 25.08.2023 06:00 - 07:00 | 0 | 0 | 0 | 0 |
| 25.08.2023 07:00 - 08:00 | 0 | 0 | 0 | 0 |
| 25.08.2023 08:00 - 09:00 | 0 | 0 | 0 | 0 |
| 25.08.2023 09:00 - 10:00 | 0 | 0 | 0 | 0 |
| 25.08.2023 10:00 - 11:00 | 0 | 0 | 0 | 0 |
| 25.08.2023 11:00 - 12:00 | 0 | 0 | 0 | 0 |
| 25.08.2023 12:00 - 13:00 | 0 | 0 | 0 | 0 |
| 25.08.2023 13:00 - 14:00 | 0 | 0 | 0 | 0 |
| 25.08.2023 14:00 - 15:00 | 0 | 0 | 0 | 0 |
| 25.08.2023 15:00 - 16:00 | 0 | 0 | 0 | 0 |
| 25.08.2023 16:00 - 17:00 | 0 | 0 | 0 | 0 |
| 25.08.2023 17:00 - 18:00 | 0 | 0 | 0 | 0 |
| 25.08.2023 18:00 - 19:00 | 0 | 0 | 0 | 0 |
| 25.08.2023 19:00 - 20:00 | 0 | 0 | 0 | 0 |
| 25.08.2023 20:00 - 21:00 | 0 | 0 | 0 | 0 |
| 25.08.2023 21:00 - 22:00 | 0 | 0 | 0 | 0 |
| 25.08.2023 22:00 - 23:00 | 0 | 0 | 0 | 0 |
| 25.08.2023 23:00 - 24:00 | 0 | 0 | 0 | 0 |
| 26.08.2023 00:00 - 01:00 | 0 | 0 | 0 | 0 |
| 26.08.2023 01:00 - 02:00 | 0 | 0 | 0 | 0 |
| 26.08.2023 02:00 - 03:00 | 0 | 0 | 0 | 0 |
| 26.08.2023 03:00 - 04:00 | 0 | 0 | 0 | 0 |
| 26.08.2023 04:00 - 05:00 | 0 | 0 | 0 | 0 |
| 26.08.2023 05:00 - 06:00 | 0 | 0 | 0 | 0 |
| 26.08.2023 06:00 - 07:00 | 0 | 0 | 0 | 0 |
| 26.08.2023 07:00 - 08:00 | 0 | 0 | 0 | 0 |
| 26.08.2023 08:00 - 09:00 | 0 | 0 | 0 | 0 |
| 26.08.2023 09:00 - 10:00 | 0 | 0 | 0 | 0 |
| 26.08.2023 10:00 - 11:00 | 0 | 0 | 0 | 0 |
| 26.08.2023 11:00 - 12:00 | 0 | 0 | 0 | 0 |
| 26.08.2023 12:00 - 13:00 | 0 | 0 | 0 | 0 |
| 26.08.2023 13:00 - 14:00 | 0 | 0 | 0 | 0 |
| 26.08.2023 14:00 - 15:00 | 0 | 0 | 0 | 0 |
| 26.08.2023 15:00 - 16:00 | 0 | 0 | 0 | 0 |
| 26.08.2023 16:00 - 17:00 | 0 | 0 | 0 | 0 |
| 26.08.2023 17:00 - 18:00 | 0 | 0 | 0 | 0 |
| 26.08.2023 18:00 - 19:00 | 0 | 0 | 0 | 0 |
| 26.08.2023 19:00 - 20:00 | 0 | 0 | 0 | 0 |
| 26.08.2023 20:00 - 21:00 | 0 | 0 | 0 | 0 |
| 26.08.2023 21:00 - 22:00 | 0 | 0 | 0 | 0 |
| 26.08.2023 22:00 - 23:00 | 0 | 0 | 0 | 0 |
| 26.08.2023 23:00 - 24:00 | 0 | 0 | 0 | 0 |
| 27.08.2023 00:00 - 01:00 | 0 | 0 | 0 | 0 |
| 27.08.2023 01:00 - 02:00 | 0 | 0 | 0 | 0 |
| 27.08.2023 02:00 - 03:00 | 0 | 0 | 0 | 0 |
| 27.08.2023 03:00 - 04:00 | 0 | 0 | 0 | 0 |
| 27.08.2023 04:00 - 05:00 | 0 | 0 | 0 | 0 |
| 27.08.2023 05:00 - 06:00 | 0 | 0 | 0 | 0 |
| 27.08.2023 06:00 - 07:00 | 0 | 0 | 0 | 0 |
| 27.08.2023 07:00 - 08:00 | 0 | 0 | 0 | 0 |
| 27.08.2023 08:00 - 09:00 | 0 | 0 | 0 | 0 |
| 27.08.2023 09:00 - 10:00 | 0 | 0 | 0 | 0 |
| 27.08.2023 10:00 - 11:00 | 0 | 0 | 0 | 0 |
| 27.08.2023 11:00 - 12:00 | 0 | 0 | 0 | 0 |
| 27.08.2023 12:00 - 13:00 | 0 | 0 | 0 | 0 |
| 27.08.2023 13:00 - 14:00 | 0 | 0 | 0 | 0 |
| 27.08.2023 14:00 - 15:00 | 0 | 0 | 0 | 0 |
| 27.08.2023 15:00 - 16:00 | 0 | 0 | 0 | 0 |
| 27.08.2023 16:00 - 17:00 | 0 | 0 | 0 | 0 |
| 27.08.2023 17:00 - 18:00 | 0 | 0 | 0 | 0 |
| 27.08.2023 18:00 - 19:00 | 0 | 0 | 0 | 0 |
| 27.08.2023 19:00 - 20:00 | 0 | 0 | 0 | 0 |
| 27.08.2023 20:00 - 21:00 | 0 | 0 | 0 | 0 |
| 27.08.2023 21:00 - 22:00 | 0 | 0 | 0 | 0 |
| 27.08.2023 22:00 - 23:00 | 0 | 0 | 0 | 0 |
| 27.08.2023 23:00 - 24:00 | 0 | 0 | 0 | 0 |
| 28.08.2023 00:00 - 01:00 | 0 | 0 | 0 | 0 |
| 28.08.2023 01:00 - 02:00 | 0 | 0 | 0 | 0 |
| 28.08.2023 02:00 - 03:00 | 0 | 0 | 0 | 0 |
| 28.08.2023 03:00 - 04:00 | 0 | 0 | 0 | 0 |
| 28.08.2023 04:00 - 05:00 | 0 | 0 | 0 | 0 |
| 28.08.2023 05:00 - 06:00 | 0 | 0 | 0 | 0 |
| 28.08.2023 06:00 - 07:00 | 0 | 0 | 0 | 0 |
| 28.08.2023 07:00 - 08:00 | 0 | 0 | 0 | 0 |
| 28.08.2023 08:00 - 09:00 | 0 | 0 | 0 | 0 |
| 28.08.2023 09:00 - 10:00 | 0 | 0 | 0 | 0 |
| 28.08.2023 10:00 - 11:00 | 0 | 0 | 0 | 0 |
| 28.08.2023 11:00 - 12:00 | 0 | 0 | 0 | 0 |
| 28.08.2023 12:00 - 13:00 | 0 | 0 | 0 | 0 |
| 28.08.2023 13:00 - 14:00 | 0 | 0 | 0 | 0 |
| 28.08.2023 14:00 - 15:00 | 0 | 0 | 0 | 0 |
| 28.08.2023 15:00 - 16:00 | 0 | 0 | 0 | 0 |
| 28.08.2023 16:00 - 17:00 | 0 | 0 | 0 | 0 |
| 28.08.2023 17:00 - 18:00 | 0 | 0 | 0 | 0 |
| 28.08.2023 18:00 - 19:00 | 0 | 0 | 0 | 0 |
| 28.08.2023 19:00 - 20:00 | 0 | 0 | 0 | 0 |
| 28.08.2023 20:00 - 21:00 | 0 | 0 | 0 | 0 |
| 28.08.2023 21:00 - 22:00 | 0 | 0 | 0 | 0 |
| 28.08.2023 22:00 - 23:00 | 0 | 0 | 0 | 0 |
| 28.08.2023 23:00 - 24:00 | 0 | 0 | 0 | 0 |
| 29.08.2023 00:00 - 01:00 | 0 | 0 | 0 | 0 |
| 29.08.2023 01:00 - 02:00 | 0 | 0 | 0 | 0 |
| 29.08.2023 02:00 - 03:00 | 0 | 0 | 0 | 0 |
| 29.08.2023 03:00 - 04:00 | 0 | 0 | 0 | 0 |
| 29.08.2023 04:00 - 05:00 | 0 | 0 | 0 | 0 |
| 29.08.2023 05:00 - 06:00 | 0 | 0 | 0 | 0 |
| 29.08.2023 06:00 - 07:00 | 0 | 0 | 0 | 0 |
| 29.08.2023 07:00 - 08:00 | 0 | 0 | 0 | 0 |
| 29.08.2023 08:00 - 09:00 | 0 | 0 | 0 | 0 |
| 29.08.2023 09:00 - 10:00 | 0 | 0 | 0 | 0 |
| 29.08.2023 10:00 - 11:00 | 0 | 0 | 0 | 0 |
| 29.08.2023 11:00 - 12:00 | 0 | 0 | 0 | 0 |
| 29.08.2023 12:00 - 13:00 | 0 | 0 | 0 | 0 |
| 29.08.2023 13:00 - 14:00 | 0 | 0 | 0 | 0 |
| 29.08.2023 14:00 - 15:00 | 0 | 0 | 0 | 0 |
| 29.08.2023 15:00 - 16:00 | 0 | 0 | 0 | 0 |
| 29.08.2023 16:00 - 17:00 | 0 | -400 | 0 | 0 |
| 29.08.2023 17:00 - 18:00 | 0 | -400 | 0 | 0 |
| 29.08.2023 18:00 - 19:00 | 0 | -400 | 0 | 0 |
| 29.08.2023 19:00 - 20:00 | 0 | -400 | 0 | 0 |
| 29.08.2023 20:00 - 21:00 | 0 | -1000 | 0 | 0 |
| 29.08.2023 21:00 - 22:00 | 0 | -1000 | 0 | 0 |
| 29.08.2023 22:00 - 23:00 | 0 | -1000 | 0 | 0 |
| 29.08.2023 23:00 - 24:00 | 0 | -1000 | 0 | 0 |
| 30.08.2023 00:00 - 01:00 | 0 | -1000 | 0 | 0 |
| 30.08.2023 01:00 - 02:00 | 0 | -1000 | 0 | 0 |
| 30.08.2023 02:00 - 03:00 | 0 | -1000 | 0 | 0 |
| 30.08.2023 03:00 - 04:00 | 0 | -1000 | 0 | 0 |
| 30.08.2023 04:00 - 05:00 | 0 | -1000 | 0 | 0 |
| 30.08.2023 05:00 - 06:00 | 0 | -1000 | 0 | 0 |
| 30.08.2023 06:00 - 07:00 | 0 | 0 | 0 | 0 |
| 30.08.2023 07:00 - 08:00 | 0 | 0 | 0 | 0 |
| 30.08.2023 08:00 - 09:00 | 0 | 0 | 0 | 0 |
| 30.08.2023 09:00 - 10:00 | 0 | 0 | 0 | 0 |
| 30.08.2023 10:00 - 11:00 | 0 | 0 | 0 | 0 |
| 30.08.2023 11:00 - 12:00 | 0 | 0 | 0 | 0 |
| 30.08.2023 12:00 - 13:00 | 0 | 0 | 0 | 0 |
| 30.08.2023 13:00 - 14:00 | 0 | 0 | 0 | 0 |
| 30.08.2023 14:00 - 15:00 | 0 | 0 | 0 | 0 |
| 30.08.2023 15:00 - 16:00 | 0 | 0 | 0 | 0 |
| 30.08.2023 16:00 - 17:00 | 0 | 0 | 0 | 0 |
| 30.08.2023 17:00 - 18:00 | 0 | 0 | 0 | 0 |
| 30.08.2023 18:00 - 19:00 | 0 | 0 | 0 | 0 |
| 30.08.2023 19:00 - 20:00 | 0 | 0 | 0 | 0 |
| 30.08.2023 20:00 - 21:00 | 0 | 0 | 0 | 0 |
| 30.08.2023 21:00 - 22:00 | 0 | 0 | 0 | 0 |
| 30.08.2023 22:00 - 23:00 | 0 | 0 | 0 | 0 |
| 30.08.2023 23:00 - 24:00 | 0 | 0 | 0 | 0 |
| 31.08.2023 00:00 - 01:00 | 0 | 0 | 0 | 0 |
| 31.08.2023 01:00 - 02:00 | 0 | 0 | 0 | 0 |
| 31.08.2023 02:00 - 03:00 | 0 | 0 | 0 | 0 |
| 31.08.2023 03:00 - 04:00 | 0 | 0 | 0 | 0 |
| 31.08.2023 04:00 - 05:00 | 0 | 0 | 0 | 0 |
| 31.08.2023 05:00 - 06:00 | 0 | 0 | 0 | 0 |